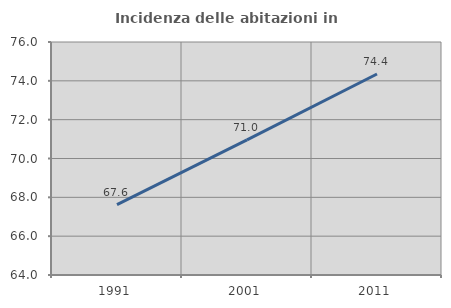
| Category | Incidenza delle abitazioni in proprietà  |
|---|---|
| 1991.0 | 67.621 |
| 2001.0 | 70.955 |
| 2011.0 | 74.352 |